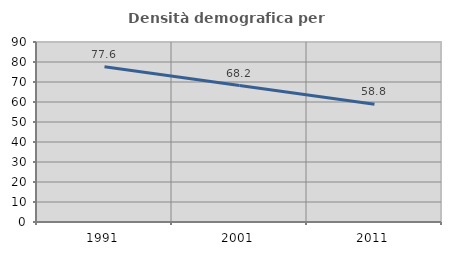
| Category | Densità demografica |
|---|---|
| 1991.0 | 77.587 |
| 2001.0 | 68.217 |
| 2011.0 | 58.847 |